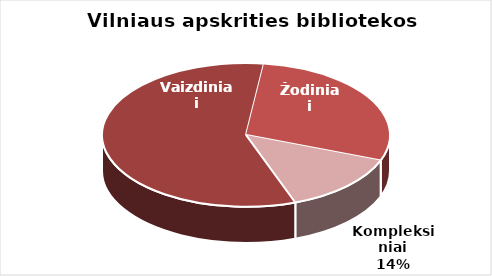
| Category | Series 0 |
|---|---|
| Vaizdiniai | 3935 |
| Žodiniai | 1968 |
| Kompleksiniai | 935 |